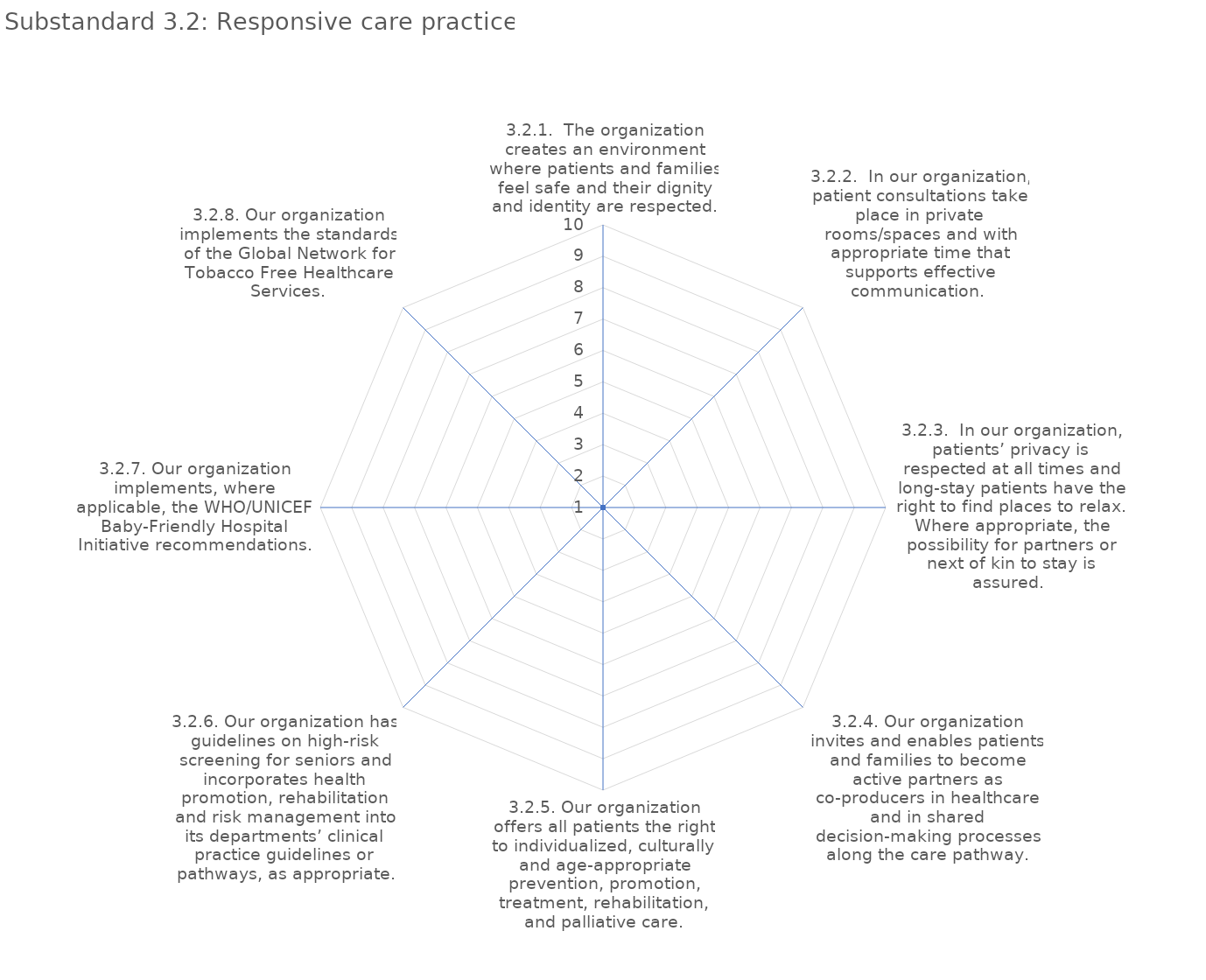
| Category | value |
|---|---|
| 3.2.1.  The organization creates an environment where patients and families feel safe and their dignity and identity are respected. | 1 |
| 3.2.2.  In our organization, patient consultations take place in private rooms/spaces and with appropriate time that supports effective communication.  | 1 |
| 3.2.3.  In our organization, patients’ privacy is respected at all times and long-stay patients have the right to find places to relax. Where appropriate, the possibility for partners or next of kin to stay is assured.  | 1 |
| 3.2.4. Our organization invites and enables patients and families to become active partners as co-producers in healthcare and in shared decision-making processes along the care pathway. | 1 |
| 3.2.5. Our organization offers all patients the right to individualized, culturally and age-appropriate prevention, promotion, treatment, rehabilitation, and palliative care. | 1 |
| 3.2.6. Our organization has guidelines on high-risk screening for seniors and incorporates health promotion, rehabilitation and risk management into its departments’ clinical practice guidelines or pathways, as appropriate. | 1 |
| 3.2.7. Our organization implements, where applicable, the WHO/UNICEF Baby-Friendly Hospital Initiative recommendations. | 1 |
| 3.2.8. Our organization implements the standards of the Global Network for Tobacco Free Healthcare Services. | 1 |